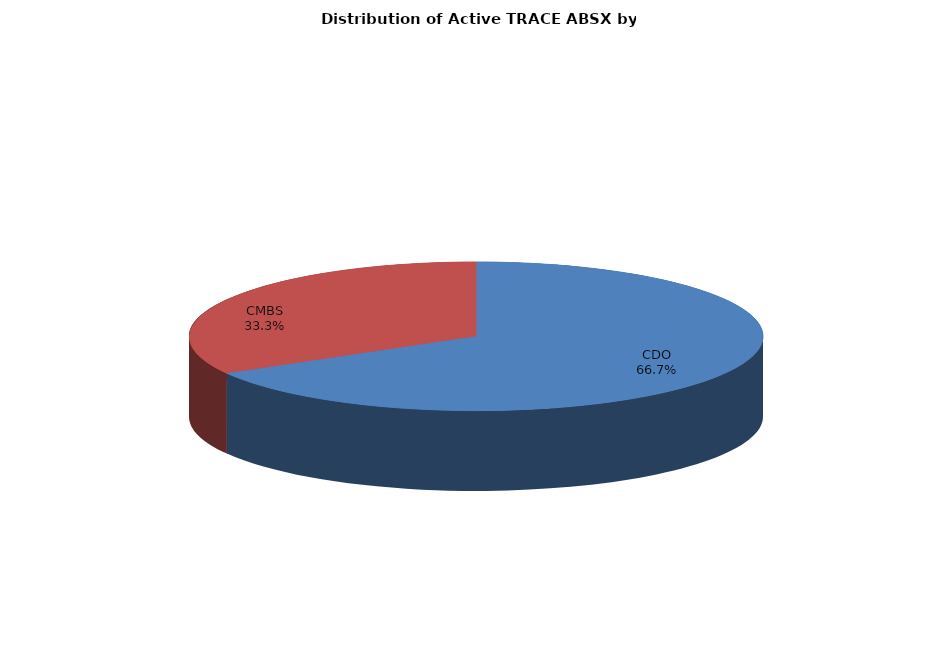
| Category | Series 0 |
|---|---|
| CDO | 70046 |
| CMBS | 34930 |